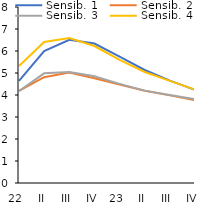
| Category | Sensib. 1 | Sensib. 2 | Sensib. 3 | Sensib. 4 | TPM |
|---|---|---|---|---|---|
| 22 | 4.646 | 4.184 | 4.184 | 5.318 |  |
| II | 5.997 | 4.808 | 4.984 | 6.413 |  |
| III | 6.513 | 5.021 | 5.05 | 6.586 |  |
| IV | 6.34 | 4.765 | 4.852 | 6.226 |  |
| 23 | 5.745 | 4.474 | 4.505 | 5.598 |  |
| II | 5.137 | 4.196 | 4.199 | 5.047 |  |
| III | 4.654 | 3.983 | 4.003 | 4.642 |  |
| IV | 4.235 | 3.768 | 3.806 | 4.248 |  |